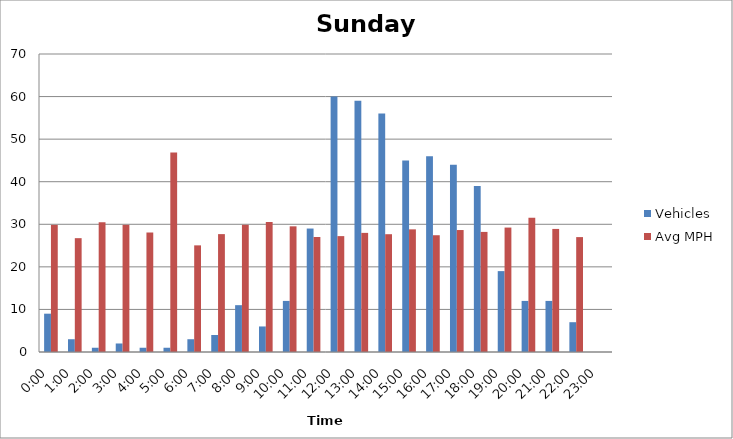
| Category | Vehicles | Avg MPH |
|---|---|---|
| 0:00 | 9 | 29.86 |
| 1:00 | 3 | 26.74 |
| 2:00 | 1 | 30.45 |
| 3:00 | 2 | 29.87 |
| 4:00 | 1 | 28.07 |
| 5:00 | 1 | 46.87 |
| 6:00 | 3 | 25.05 |
| 7:00 | 4 | 27.69 |
| 8:00 | 11 | 29.88 |
| 9:00 | 6 | 30.51 |
| 10:00 | 12 | 29.52 |
| 11:00 | 29 | 27.01 |
| 12:00 | 60 | 27.22 |
| 13:00 | 59 | 27.98 |
| 14:00 | 56 | 27.67 |
| 15:00 | 45 | 28.81 |
| 16:00 | 46 | 27.43 |
| 17:00 | 44 | 28.65 |
| 18:00 | 39 | 28.21 |
| 19:00 | 19 | 29.23 |
| 20:00 | 12 | 31.51 |
| 21:00 | 12 | 28.91 |
| 22:00 | 7 | 26.99 |
| 23:00 | 0 | 0 |